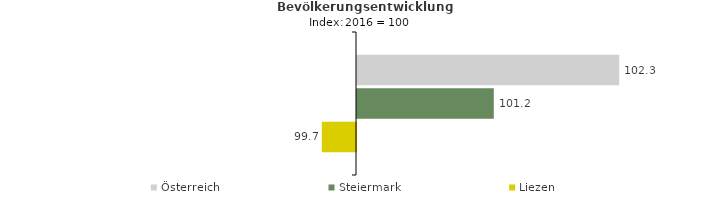
| Category | Österreich | Steiermark | Liezen |
|---|---|---|---|
| 2020.0 | 102.3 | 101.2 | 99.7 |